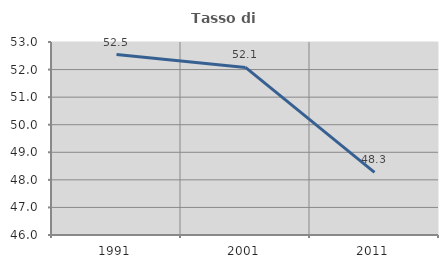
| Category | Tasso di occupazione   |
|---|---|
| 1991.0 | 52.544 |
| 2001.0 | 52.079 |
| 2011.0 | 48.272 |